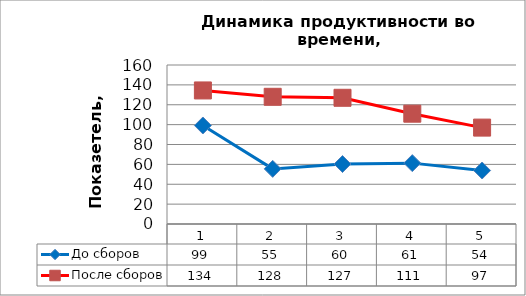
| Category | До сборов | После сборов |
|---|---|---|
| 0 | 99.13 | 134.4 |
| 1 | 55.474 | 128 |
| 2 | 60.35 | 127 |
| 3 | 61.25 | 111 |
| 4 | 53.833 | 97 |